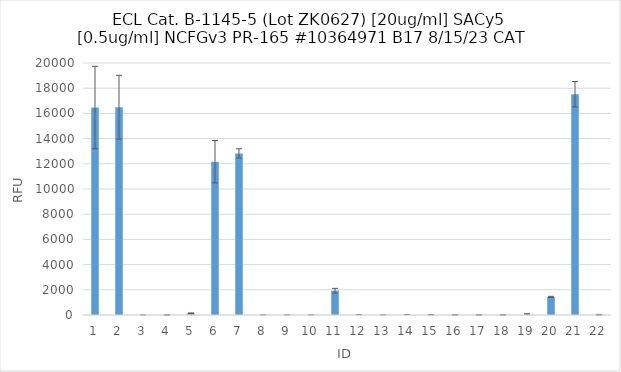
| Category | RFU |
|---|---|
| 0 | 16466 |
| 1 | 16495.5 |
| 2 | 0 |
| 3 | 1.25 |
| 4 | 139.25 |
| 5 | 12166.75 |
| 6 | 12823.25 |
| 7 | 3.25 |
| 8 | 2 |
| 9 | 4.25 |
| 10 | 1926.5 |
| 11 | 2.5 |
| 12 | 1.75 |
| 13 | 2.25 |
| 14 | -15.25 |
| 15 | 9.75 |
| 16 | 3.5 |
| 17 | 4.25 |
| 18 | -79 |
| 19 | 1435 |
| 20 | 17521 |
| 21 | 27.5 |